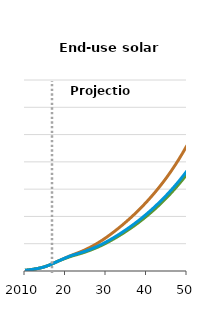
| Category | No PTC/ITC Sunset case | Early PTC/ITC Sunset case | Reference case |
|---|---|---|---|
| 2010.0 | 2.499 | 2.499 | 2.499 |
| 2011.0 | 3.924 | 3.924 | 3.924 |
| 2012.0 | 6.238 | 6.238 | 6.238 |
| 2013.0 | 8.721 | 8.721 | 8.721 |
| 2014.0 | 11.961 | 11.961 | 11.961 |
| 2015.0 | 16.142 | 16.142 | 16.142 |
| 2016.0 | 21.687 | 21.687 | 21.687 |
| 2017.0 | 28.184 | 28.184 | 28.183 |
| 2018.0 | 34.902 | 34.905 | 34.9 |
| 2019.0 | 41.615 | 40.794 | 41.612 |
| 20.0 | 48.228 | 46.477 | 48.078 |
| 2021.0 | 54.643 | 51.806 | 54.163 |
| 2022.0 | 60.672 | 56.596 | 59.133 |
| 2023.0 | 66.205 | 60.735 | 63.424 |
| 2024.0 | 72.257 | 65.224 | 68.045 |
| 2025.0 | 78.898 | 70.107 | 73.101 |
| 2026.0 | 86.225 | 75.469 | 78.65 |
| 2027.0 | 94.186 | 81.297 | 84.677 |
| 2028.0 | 102.801 | 87.596 | 91.198 |
| 2029.0 | 112.157 | 94.466 | 98.323 |
| 30.0 | 122.262 | 101.954 | 106.12 |
| 2031.0 | 132.949 | 109.915 | 114.43 |
| 2032.0 | 144.111 | 118.238 | 123.136 |
| 2033.0 | 155.808 | 126.986 | 132.286 |
| 2034.0 | 167.979 | 136.115 | 141.827 |
| 2035.0 | 180.737 | 145.717 | 151.847 |
| 2036.0 | 193.967 | 155.721 | 162.241 |
| 2037.0 | 207.718 | 166.129 | 173.04 |
| 2038.0 | 222.134 | 177.088 | 184.374 |
| 2039.0 | 237.115 | 188.531 | 196.173 |
| 40.0 | 252.905 | 200.584 | 208.59 |
| 2041.0 | 269.354 | 213.086 | 221.493 |
| 2042.0 | 286.535 | 226.122 | 234.92 |
| 2043.0 | 304.635 | 239.808 | 249.049 |
| 2044.0 | 323.526 | 254.071 | 263.729 |
| 2045.0 | 343.317 | 268.979 | 278.973 |
| 2046.0 | 364.277 | 284.709 | 295.007 |
| 2047.0 | 386.353 | 301.129 | 311.746 |
| 2048.0 | 409.577 | 318.237 | 329.275 |
| 2049.0 | 434.26 | 336.295 | 347.796 |
| 50.0 | 460.199 | 355.14 | 367.075 |